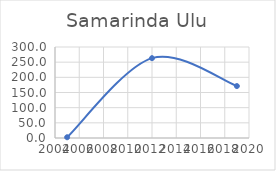
| Category | Series 0 |
|---|---|
| 2005.0 | 2.453 |
| 2012.0 | 263.196 |
| 2019.0 | 171.2 |